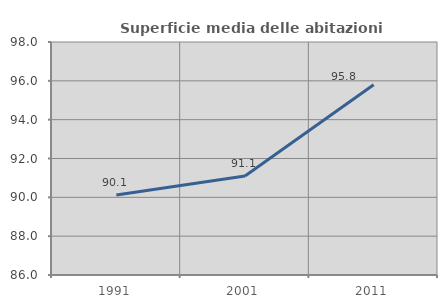
| Category | Superficie media delle abitazioni occupate |
|---|---|
| 1991.0 | 90.116 |
| 2001.0 | 91.1 |
| 2011.0 | 95.802 |